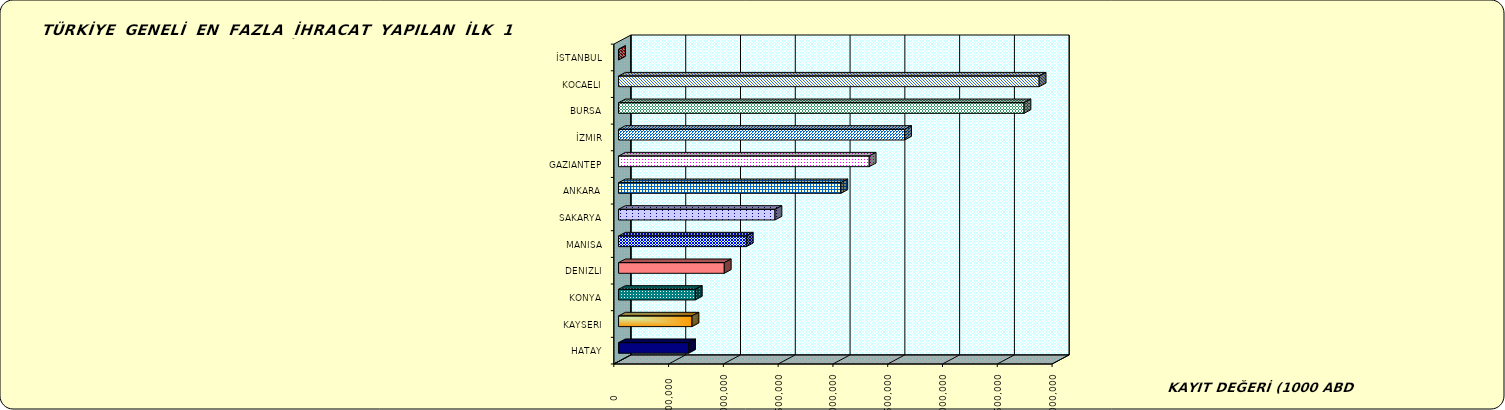
| Category | Series 0 |
|---|---|
| İSTANBUL | 5.094 |
| KOCAELI | 3838878.697 |
| BURSA | 3700473.783 |
| İZMIR | 2610569.568 |
| GAZIANTEP | 2287656.245 |
| ANKARA | 2029212.696 |
| SAKARYA | 1427605.444 |
| MANISA | 1166074.387 |
| DENIZLI | 964879.958 |
| KONYA | 700570.585 |
| KAYSERI | 670438.859 |
| HATAY | 639269.931 |